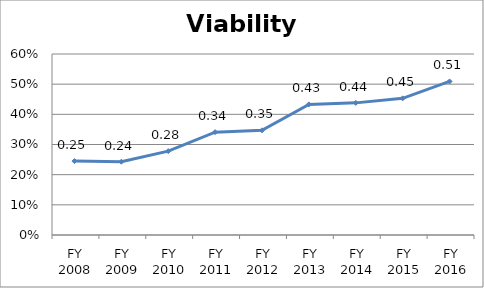
| Category | Viability ratio |
|---|---|
| FY 2016 | 0.509 |
| FY 2015 | 0.453 |
| FY 2014 | 0.438 |
| FY 2013 | 0.433 |
| FY 2012 | 0.347 |
| FY 2011 | 0.341 |
| FY 2010 | 0.278 |
| FY 2009 | 0.243 |
| FY 2008 | 0.245 |